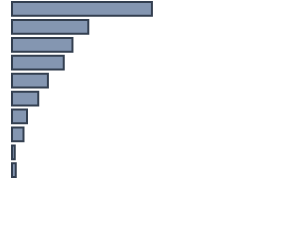
| Category | Series 0 |
|---|---|
| 0 | 53 |
| 1 | 28.9 |
| 2 | 22.9 |
| 3 | 19.6 |
| 4 | 13.6 |
| 5 | 9.9 |
| 6 | 5.7 |
| 7 | 4.4 |
| 8 | 1 |
| 9 | 1.4 |
| 10 | 0 |
| 11 | 0 |